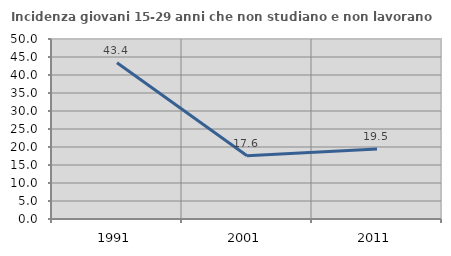
| Category | Incidenza giovani 15-29 anni che non studiano e non lavorano  |
|---|---|
| 1991.0 | 43.378 |
| 2001.0 | 17.582 |
| 2011.0 | 19.459 |